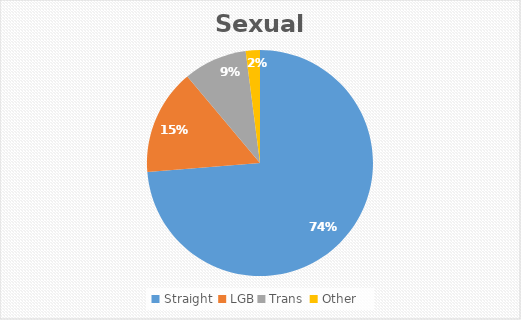
| Category | Series 0 |
|---|---|
| Straight  | 0.737 |
| LGB | 0.152 |
| Trans  | 0.091 |
| Other | 0.02 |